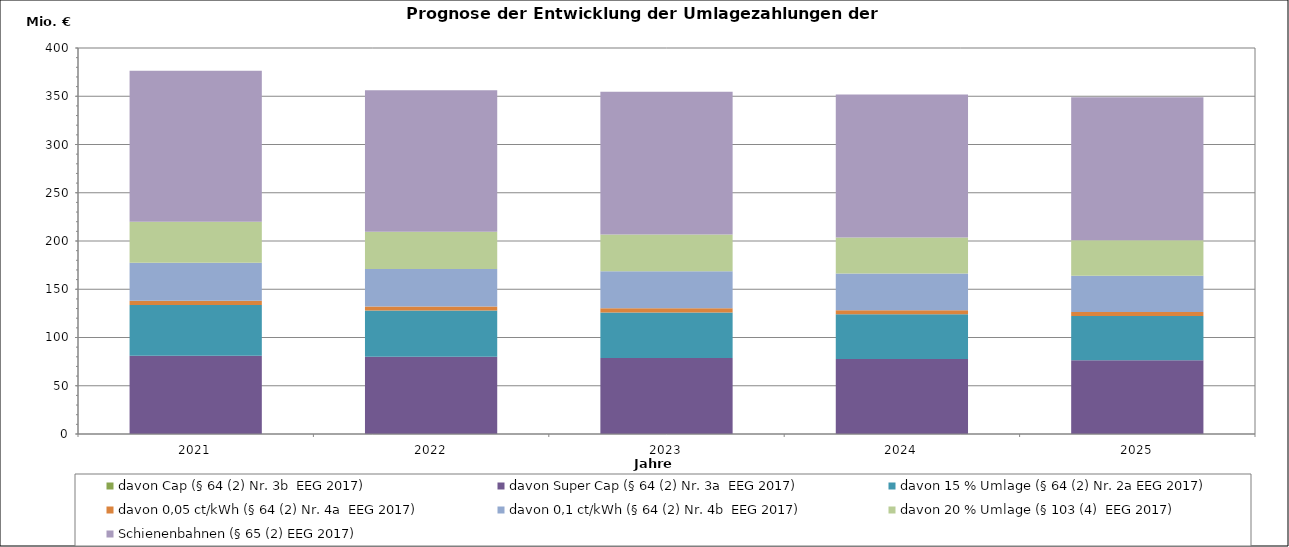
| Category | davon Cap (§ 64 (2) Nr. 3b  EEG 2017) | davon Super Cap (§ 64 (2) Nr. 3a  EEG 2017) | davon 15 % Umlage (§ 64 (2) Nr. 2a EEG 2017) | davon 0,05 ct/kWh (§ 64 (2) Nr. 4a  EEG 2017) | davon 0,1 ct/kWh (§ 64 (2) Nr. 4b  EEG 2017) | davon 20 % Umlage (§ 103 (4)  EEG 2017) | Schienenbahnen (§ 65 (2) EEG 2017) |
|---|---|---|---|---|---|---|---|
| 2021.0 | 0 | 81.158 | 52.594 | 4.368 | 39.293 | 42.453 | 156.493 |
| 2022.0 | 0 | 79.997 | 47.86 | 4.322 | 38.878 | 38.563 | 146.663 |
| 2023.0 | 0 | 78.825 | 47.156 | 4.274 | 38.448 | 37.947 | 148.085 |
| 2024.0 | 0 | 77.655 | 46.443 | 4.225 | 38.011 | 37.344 | 148.217 |
| 2025.0 | 0 | 76.502 | 45.735 | 4.177 | 37.577 | 36.756 | 148.291 |